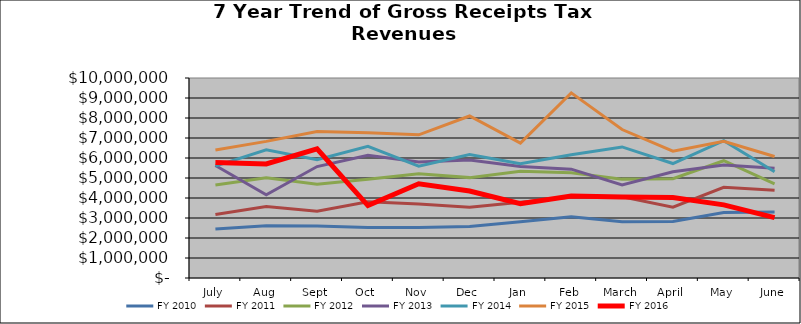
| Category | FY 2010 | FY 2011 | FY 2012 | FY 2013 | FY 2014 | FY 2015 | FY 2016 |
|---|---|---|---|---|---|---|---|
| July | 2451198.562 | 3177096.811 | 4654839.783 | 5626059.881 | 5595087.291 | 6402668.283 | 5772739.829 |
| Aug | 2617250.51 | 3580294.404 | 5017083.615 | 4164832.935 | 6411179.831 | 6831952.209 | 5699233.698 |
| Sept | 2599970.649 | 3335454.878 | 4685581.497 | 5572700.46 | 5917200.84 | 7322430.773 | 6460706.214 |
| Oct | 2524216.318 | 3808790.307 | 4941725.48 | 6132021.769 | 6582811.647 | 7267058.582 | 3620987.355 |
| Nov | 2519766.36 | 3701475.275 | 5217449.999 | 5801761.569 | 5592692.707 | 7157385.434 | 4712839.702 |
| Dec | 2569347.738 | 3538887.473 | 5019105.309 | 5905149.162 | 6172595.834 | 8099740.568 | 4346447.419 |
| Jan | 2809349.542 | 3790904.236 | 5341376.267 | 5571555.174 | 5709226.879 | 6747067.811 | 3713809.115 |
| Feb | 3066473.072 | 4044932.737 | 5265845.607 | 5442808.037 | 6164336.729 | 9256621.614 | 4102634.794 |
| March | 2817258.105 | 4057583.198 | 4943765.505 | 4651484.819 | 6554074.801 | 7424667.4 | 4044183.25 |
| April | 2822732.994 | 3543249.909 | 4965041.79 | 5308133.539 | 5722893.152 | 6344409.285 | 4018940.954 |
| May | 3276793.929 | 4537393.682 | 5863580.963 | 5644373.856 | 6864060.24 | 6832493.915 | 3657946.467 |
| June | 3305912.887 | 4391648.949 | 4703417.909 | 5489267.558 | 5314571.641 | 6076349.764 | 3018653.807 |